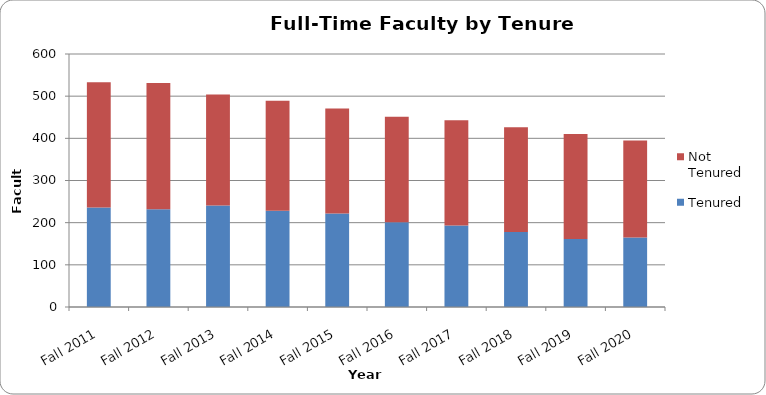
| Category | Tenured | Not Tenured |
|---|---|---|
| Fall 2011 | 236 | 297 |
| Fall 2012 | 232 | 299 |
| Fall 2013 | 241 | 263 |
| Fall 2014 | 228 | 261 |
| Fall 2015 | 222 | 249 |
| Fall 2016 | 201 | 250 |
| Fall 2017 | 193 | 250 |
| Fall 2018 | 178 | 248 |
| Fall 2019 | 161 | 249 |
| Fall 2020 | 165 | 230 |